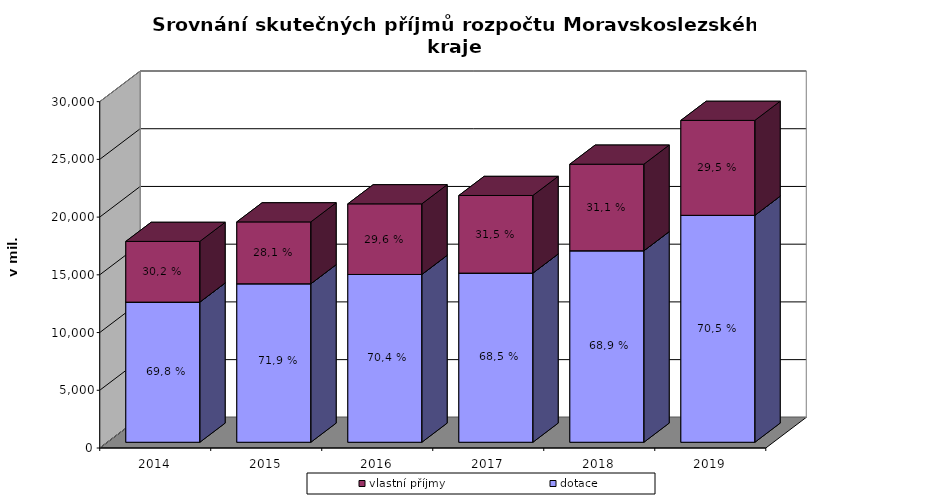
| Category | dotace | vlastní příjmy |
|---|---|---|
| 2014.0 | 12137.583 | 5259.023 |
| 2015.0 | 13726.48 | 5360.395 |
| 2016.0 | 14534.133 | 6116.069 |
| 2017.0 | 14651.604 | 6723.521 |
| 2018.0 | 16584.967 | 7499.883 |
| 2019.0 | 19656.418 | 8223.054 |